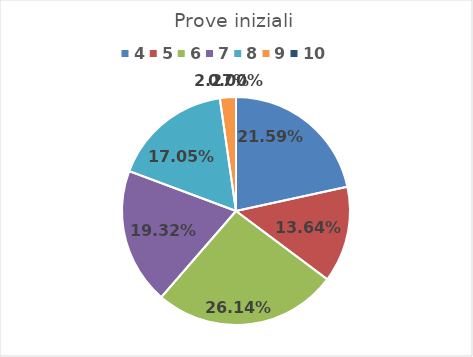
| Category | Series 0 |
|---|---|
| 4.0 | 0.216 |
| 5.0 | 0.136 |
| 6.0 | 0.261 |
| 7.0 | 0.193 |
| 8.0 | 0.17 |
| 9.0 | 0.023 |
| 10.0 | 0 |